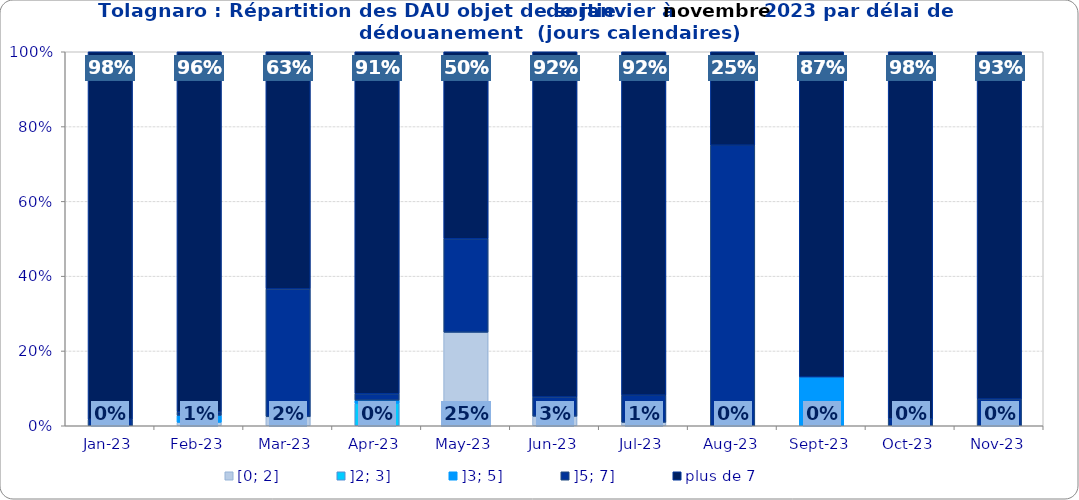
| Category | [0; 2] | ]2; 3] | ]3; 5] | ]5; 7] | plus de 7 |
|---|---|---|---|---|---|
| 2023-01-01 | 0 | 0 | 0 | 0.017 | 0.983 |
| 2023-02-01 | 0.009 | 0 | 0.019 | 0.009 | 0.963 |
| 2023-03-01 | 0.024 | 0 | 0 | 0.341 | 0.634 |
| 2023-04-01 | 0 | 0.06 | 0.009 | 0.017 | 0.915 |
| 2023-05-01 | 0.25 | 0 | 0 | 0.25 | 0.5 |
| 2023-06-01 | 0.026 | 0 | 0 | 0.051 | 0.923 |
| 2023-07-01 | 0.009 | 0 | 0 | 0.073 | 0.918 |
| 2023-08-01 | 0 | 0 | 0 | 0.75 | 0.25 |
| 2023-09-01 | 0 | 0 | 0.13 | 0 | 0.87 |
| 2023-10-01 | 0 | 0 | 0 | 0.019 | 0.981 |
| 2023-11-01 | 0 | 0 | 0 | 0.071 | 0.929 |